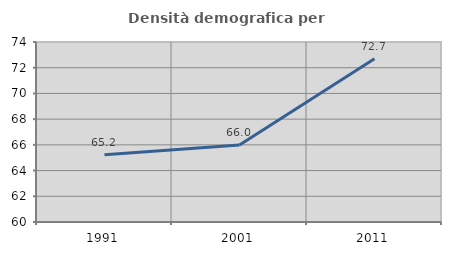
| Category | Densità demografica |
|---|---|
| 1991.0 | 65.239 |
| 2001.0 | 65.99 |
| 2011.0 | 72.691 |